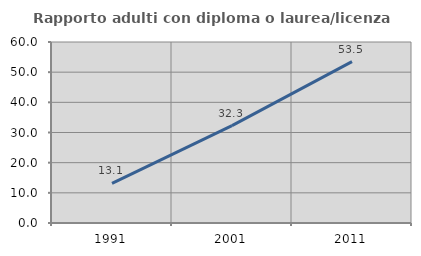
| Category | Rapporto adulti con diploma o laurea/licenza media  |
|---|---|
| 1991.0 | 13.115 |
| 2001.0 | 32.278 |
| 2011.0 | 53.476 |